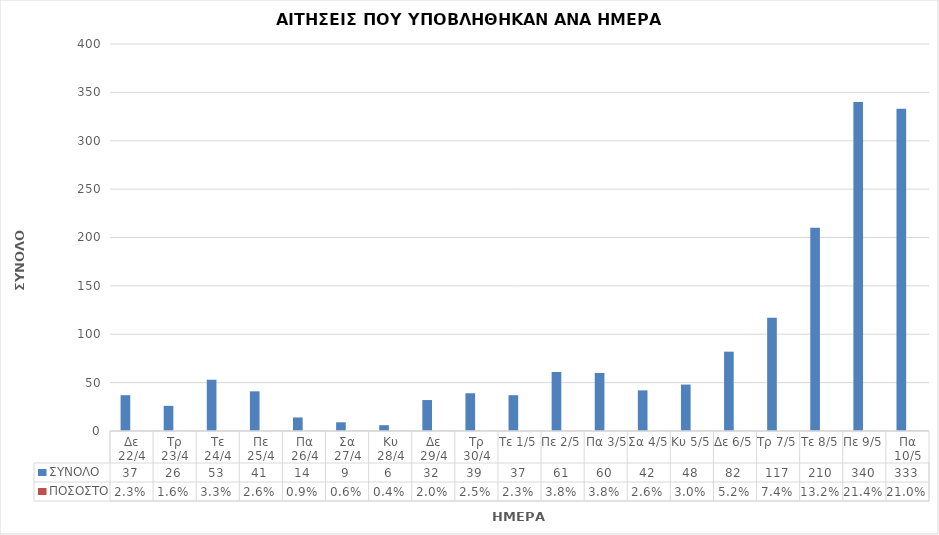
| Category | ΣΥΝΟΛΟ | ΠΟΣΟΣΤΟ |
|---|---|---|
| Δε 22/4 | 37 | 0.023 |
| Τρ 23/4 | 26 | 0.016 |
| Τε 24/4 | 53 | 0.033 |
| Πε 25/4 | 41 | 0.026 |
| Πα 26/4 | 14 | 0.009 |
| Σα 27/4 | 9 | 0.006 |
| Κυ 28/4 | 6 | 0.004 |
| Δε 29/4 | 32 | 0.02 |
| Τρ 30/4 | 39 | 0.025 |
| Τε 1/5 | 37 | 0.023 |
| Πε 2/5 | 61 | 0.038 |
| Πα 3/5 | 60 | 0.038 |
| Σα 4/5 | 42 | 0.026 |
| Κυ 5/5 | 48 | 0.03 |
| Δε 6/5 | 82 | 0.052 |
| Τρ 7/5 | 117 | 0.074 |
| Τε 8/5 | 210 | 0.132 |
| Πε 9/5 | 340 | 0.214 |
| Πα 10/5 | 333 | 0.21 |